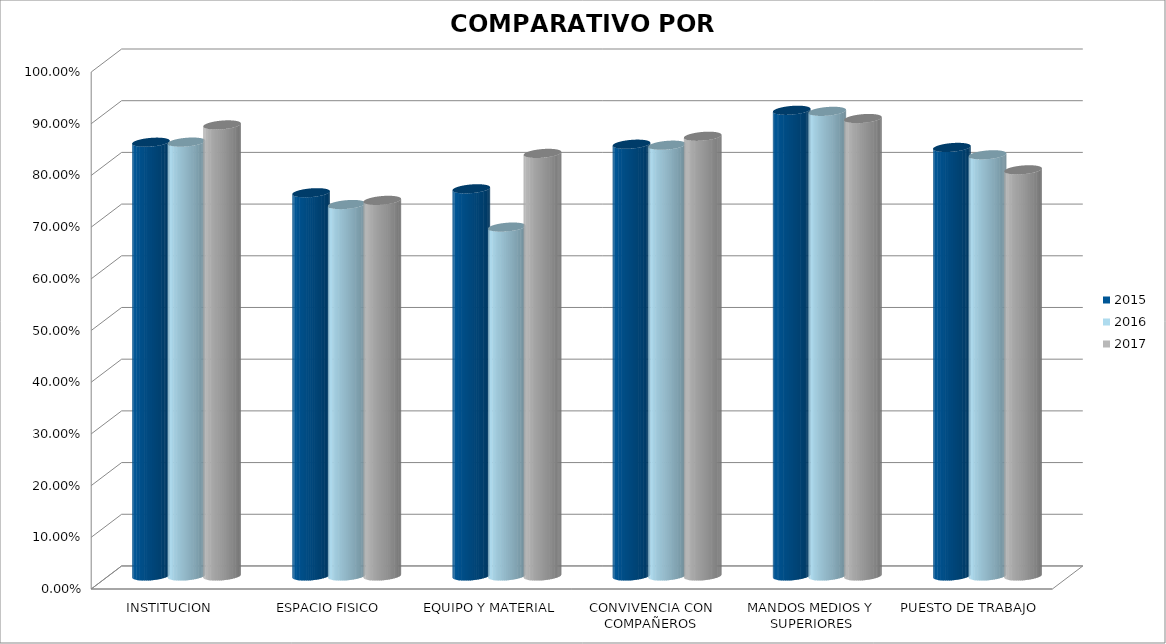
| Category | 2015 | 2016 | 2017 |
|---|---|---|---|
| INSTITUCION | 0.839 | 0.839 | 0.873 |
| ESPACIO FISICO | 0.741 | 0.719 | 0.727 |
| EQUIPO Y MATERIAL | 0.749 | 0.675 | 0.817 |
| CONVIVENCIA CON COMPAÑEROS | 0.835 | 0.833 | 0.851 |
| MANDOS MEDIOS Y SUPERIORES | 0.901 | 0.899 | 0.885 |
| PUESTO DE TRABAJO | 0.829 | 0.815 | 0.786 |